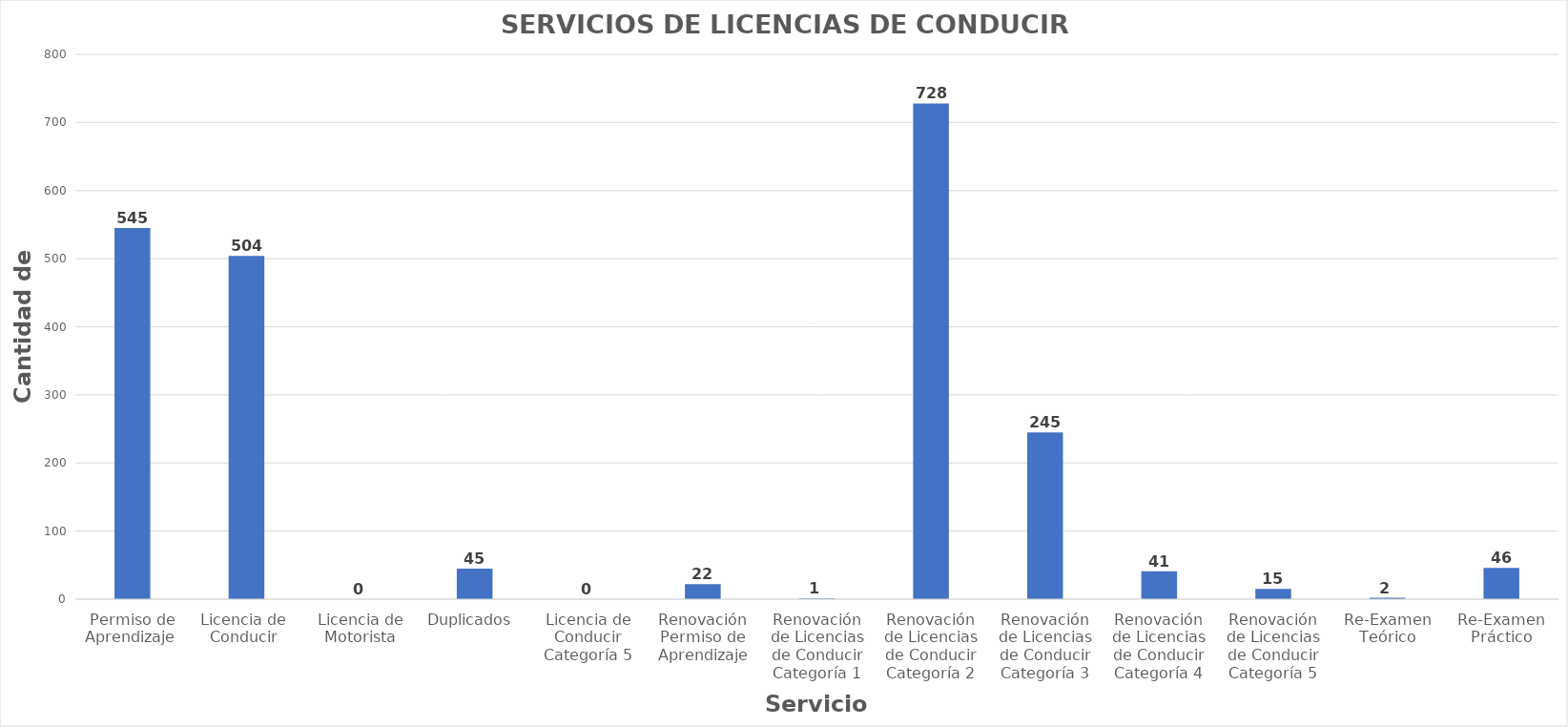
| Category | Series 0 |
|---|---|
| Permiso de Aprendizaje  | 545 |
| Licencia de  Conducir  | 504 |
| Licencia de Motorista | 0 |
| Duplicados  | 45 |
| Licencia de Conducir Categoría 5 | 0 |
| Renovación Permiso de Aprendizaje | 22 |
| Renovación de Licencias de Conducir Categoría 1 | 1 |
| Renovación de Licencias de Conducir Categoría 2 | 728 |
| Renovación de Licencias de Conducir Categoría 3 | 245 |
| Renovación de Licencias de Conducir Categoría 4 | 41 |
| Renovación de Licencias de Conducir Categoría 5 | 15 |
| Re-Examen Teórico | 2 |
| Re-Examen Práctico | 46 |